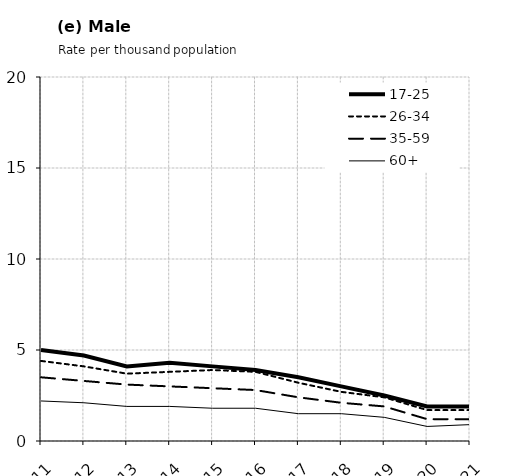
| Category | 17-25 | 26-34 | 35-59 | 60+ |
|---|---|---|---|---|
| 2011.0 | 5 | 4.4 | 3.5 | 2.2 |
| 2012.0 | 4.7 | 4.1 | 3.3 | 2.1 |
| 2013.0 | 4.1 | 3.7 | 3.1 | 1.9 |
| 2014.0 | 4.3 | 3.8 | 3 | 1.9 |
| 2015.0 | 4.1 | 3.9 | 2.9 | 1.8 |
| 2016.0 | 3.9 | 3.8 | 2.8 | 1.8 |
| 2017.0 | 3.5 | 3.2 | 2.4 | 1.5 |
| 2018.0 | 3 | 2.7 | 2.1 | 1.5 |
| 2019.0 | 2.5 | 2.4 | 1.9 | 1.3 |
| 2020.0 | 1.9 | 1.7 | 1.2 | 0.8 |
| 2021.0 | 1.9 | 1.7 | 1.2 | 0.9 |